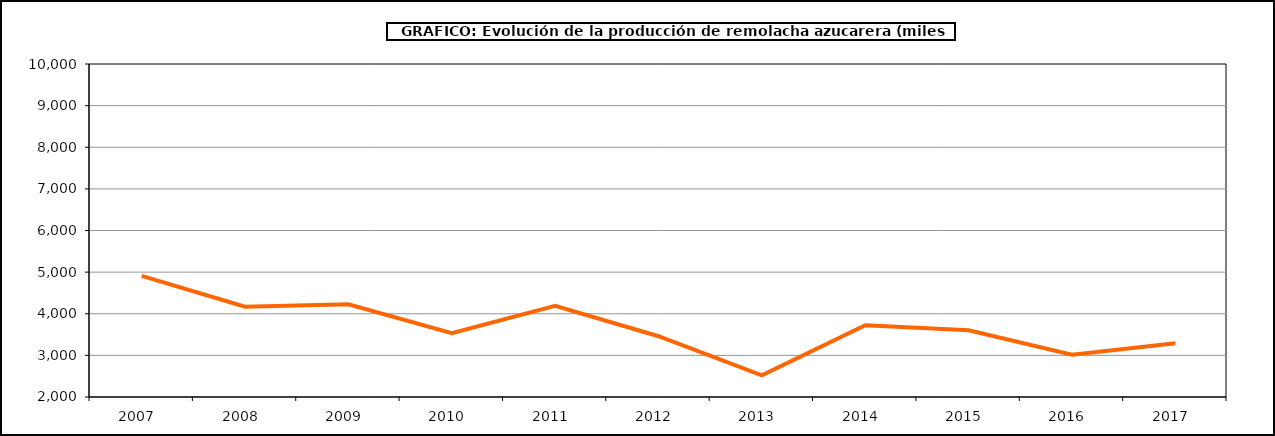
| Category | Producción |
|---|---|
| 2007.0 | 4909.958 |
| 2008.0 | 4170.442 |
| 2009.0 | 4225.433 |
| 2010.0 | 3534.517 |
| 2011.0 | 4188.535 |
| 2012.0 | 3460.23 |
| 2013.0 | 2519.482 |
| 2014.0 | 3723.309 |
| 2015.0 | 3605.112 |
| 2016.0 | 3014.358 |
| 2017.0 | 3292.75 |